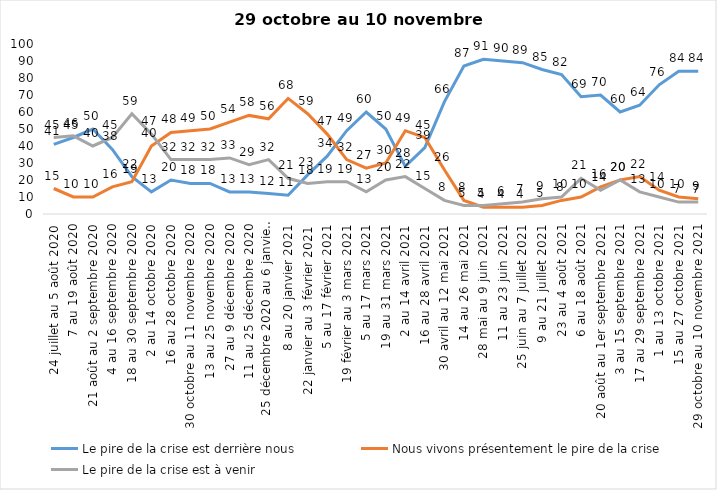
| Category | Le pire de la crise est derrière nous | Nous vivons présentement le pire de la crise | Le pire de la crise est à venir |
|---|---|---|---|
| 24 juillet au 5 août 2020 | 41 | 15 | 45 |
| 7 au 19 août 2020 | 45 | 10 | 46 |
| 21 août au 2 septembre 2020 | 50 | 10 | 40 |
| 4 au 16 septembre 2020 | 38 | 16 | 45 |
| 18 au 30 septembre 2020 | 22 | 19 | 59 |
| 2 au 14 octobre 2020 | 13 | 40 | 47 |
| 16 au 28 octobre 2020 | 20 | 48 | 32 |
| 30 octobre au 11 novembre 2020 | 18 | 49 | 32 |
| 13 au 25 novembre 2020 | 18 | 50 | 32 |
| 27 au 9 décembre 2020 | 13 | 54 | 33 |
| 11 au 25 décembre 2020 | 13 | 58 | 29 |
| 25 décembre 2020 au 6 janvier 2021 | 12 | 56 | 32 |
| 8 au 20 janvier 2021 | 11 | 68 | 21 |
| 22 janvier au 3 février 2021 | 23 | 59 | 18 |
| 5 au 17 février 2021 | 34 | 47 | 19 |
| 19 février au 3 mars 2021 | 49 | 32 | 19 |
| 5 au 17 mars 2021 | 60 | 27 | 13 |
| 19 au 31 mars 2021 | 50 | 30 | 20 |
| 2 au 14 avril 2021 | 28 | 49 | 22 |
| 16 au 28 avril 2021 | 39 | 45 | 15 |
| 30 avril au 12 mai 2021 | 66 | 26 | 8 |
| 14 au 26 mai 2021 | 87 | 8 | 5 |
| 28 mai au 9 juin 2021 | 91 | 4 | 5 |
| 11 au 23 juin 2021 | 90 | 4 | 6 |
| 25 juin au 7 juillet 2021 | 89 | 4 | 7 |
| 9 au 21 juillet 2021 | 85 | 5 | 9 |
| 23 au 4 août 2021 | 82 | 8 | 10 |
| 6 au 18 août 2021 | 69 | 10 | 21 |
| 20 août au 1er septembre 2021 | 70 | 16 | 14 |
| 3 au 15 septembre 2021 | 60 | 20 | 20 |
| 17 au 29 septembre 2021 | 64 | 22 | 13 |
| 1 au 13 octobre 2021 | 76 | 14 | 10 |
| 15 au 27 octobre 2021 | 84 | 10 | 7 |
| 29 octobre au 10 novembre 2021 | 84 | 9 | 7 |